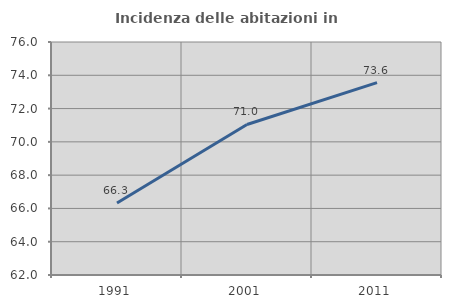
| Category | Incidenza delle abitazioni in proprietà  |
|---|---|
| 1991.0 | 66.326 |
| 2001.0 | 71.045 |
| 2011.0 | 73.556 |